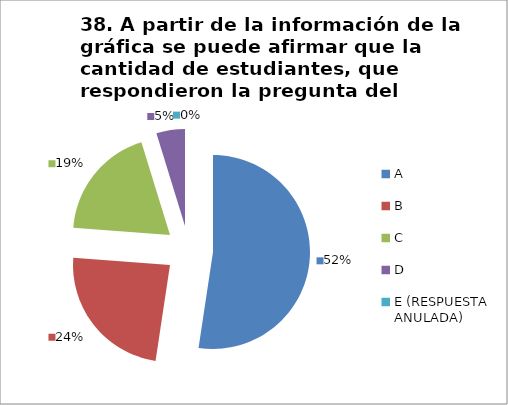
| Category | CANTIDAD DE RESPUESTAS PREGUNTA (38) | PORCENTAJE |
|---|---|---|
| A | 11 | 0.524 |
| B | 5 | 0.238 |
| C | 4 | 0.19 |
| D | 1 | 0.048 |
| E (RESPUESTA ANULADA) | 0 | 0 |